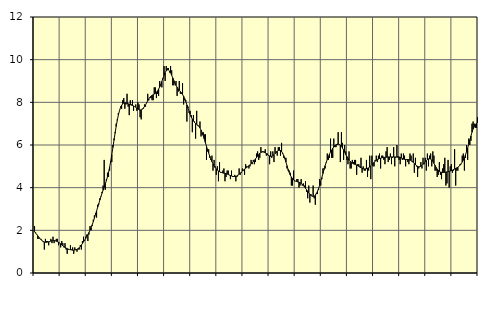
| Category | Piggar | Series 1 |
|---|---|---|
| nan | 2.2 | 1.94 |
| 87.0 | 1.9 | 1.87 |
| 87.0 | 1.8 | 1.81 |
| 87.0 | 1.6 | 1.74 |
| 87.0 | 1.6 | 1.67 |
| 87.0 | 1.6 | 1.61 |
| 87.0 | 1.6 | 1.56 |
| 87.0 | 1.5 | 1.51 |
| 87.0 | 1.5 | 1.47 |
| 87.0 | 1.1 | 1.45 |
| 87.0 | 1.6 | 1.44 |
| 87.0 | 1.5 | 1.44 |
| nan | 1.5 | 1.45 |
| 88.0 | 1.3 | 1.46 |
| 88.0 | 1.5 | 1.48 |
| 88.0 | 1.6 | 1.5 |
| 88.0 | 1.4 | 1.51 |
| 88.0 | 1.7 | 1.52 |
| 88.0 | 1.4 | 1.52 |
| 88.0 | 1.5 | 1.51 |
| 88.0 | 1.6 | 1.49 |
| 88.0 | 1.6 | 1.47 |
| 88.0 | 1.3 | 1.44 |
| 88.0 | 1.4 | 1.41 |
| nan | 1.2 | 1.37 |
| 89.0 | 1.5 | 1.32 |
| 89.0 | 1.4 | 1.28 |
| 89.0 | 1.2 | 1.24 |
| 89.0 | 1.4 | 1.2 |
| 89.0 | 1.1 | 1.17 |
| 89.0 | 0.9 | 1.14 |
| 89.0 | 1.1 | 1.12 |
| 89.0 | 1.1 | 1.1 |
| 89.0 | 1.3 | 1.09 |
| 89.0 | 1.1 | 1.08 |
| 89.0 | 1.2 | 1.07 |
| nan | 0.9 | 1.07 |
| 90.0 | 1.2 | 1.08 |
| 90.0 | 1.1 | 1.09 |
| 90.0 | 1 | 1.11 |
| 90.0 | 1.1 | 1.14 |
| 90.0 | 1.1 | 1.18 |
| 90.0 | 1.3 | 1.24 |
| 90.0 | 1.1 | 1.31 |
| 90.0 | 1.5 | 1.38 |
| 90.0 | 1.7 | 1.46 |
| 90.0 | 1.5 | 1.54 |
| 90.0 | 1.7 | 1.62 |
| nan | 1.8 | 1.71 |
| 91.0 | 1.5 | 1.8 |
| 91.0 | 1.8 | 1.9 |
| 91.0 | 2.2 | 2.01 |
| 91.0 | 2 | 2.13 |
| 91.0 | 2.2 | 2.26 |
| 91.0 | 2.5 | 2.41 |
| 91.0 | 2.7 | 2.57 |
| 91.0 | 2.8 | 2.74 |
| 91.0 | 2.6 | 2.91 |
| 91.0 | 3.2 | 3.08 |
| 91.0 | 3.2 | 3.25 |
| nan | 3.5 | 3.42 |
| 92.0 | 3.6 | 3.58 |
| 92.0 | 3.8 | 3.74 |
| 92.0 | 4.1 | 3.88 |
| 92.0 | 5.3 | 4.02 |
| 92.0 | 3.9 | 4.17 |
| 92.0 | 4.4 | 4.33 |
| 92.0 | 4.7 | 4.51 |
| 92.0 | 4.5 | 4.72 |
| 92.0 | 4.8 | 4.96 |
| 92.0 | 5.2 | 5.24 |
| 92.0 | 5.2 | 5.55 |
| nan | 6 | 5.88 |
| 93.0 | 6.3 | 6.22 |
| 93.0 | 6.6 | 6.55 |
| 93.0 | 7 | 6.87 |
| 93.0 | 7.2 | 7.15 |
| 93.0 | 7.5 | 7.4 |
| 93.0 | 7.6 | 7.6 |
| 93.0 | 7.8 | 7.76 |
| 93.0 | 7.7 | 7.86 |
| 93.0 | 8.1 | 7.93 |
| 93.0 | 8.2 | 7.97 |
| 93.0 | 7.7 | 7.98 |
| nan | 7.9 | 7.97 |
| 94.0 | 8.4 | 7.96 |
| 94.0 | 7.8 | 7.93 |
| 94.0 | 7.4 | 7.91 |
| 94.0 | 8.1 | 7.89 |
| 94.0 | 7.9 | 7.87 |
| 94.0 | 8.1 | 7.85 |
| 94.0 | 7.6 | 7.83 |
| 94.0 | 7.8 | 7.8 |
| 94.0 | 7.9 | 7.77 |
| 94.0 | 7.6 | 7.73 |
| 94.0 | 8 | 7.69 |
| nan | 7.9 | 7.66 |
| 95.0 | 7.3 | 7.64 |
| 95.0 | 7.2 | 7.65 |
| 95.0 | 7.7 | 7.68 |
| 95.0 | 7.7 | 7.73 |
| 95.0 | 7.9 | 7.8 |
| 95.0 | 7.8 | 7.88 |
| 95.0 | 8 | 7.98 |
| 95.0 | 8.4 | 8.07 |
| 95.0 | 8.1 | 8.16 |
| 95.0 | 8.2 | 8.23 |
| 95.0 | 8.2 | 8.29 |
| nan | 8.1 | 8.32 |
| 96.0 | 8.1 | 8.36 |
| 96.0 | 8.7 | 8.39 |
| 96.0 | 8.7 | 8.42 |
| 96.0 | 8.2 | 8.47 |
| 96.0 | 8.4 | 8.53 |
| 96.0 | 8.3 | 8.62 |
| 96.0 | 9 | 8.72 |
| 96.0 | 8.8 | 8.84 |
| 96.0 | 8.7 | 8.98 |
| 96.0 | 9.1 | 9.13 |
| 96.0 | 9.7 | 9.27 |
| nan | 9 | 9.39 |
| 97.0 | 9.7 | 9.48 |
| 97.0 | 9.6 | 9.52 |
| 97.0 | 9.6 | 9.52 |
| 97.0 | 9.4 | 9.47 |
| 97.0 | 9.7 | 9.39 |
| 97.0 | 9.5 | 9.27 |
| 97.0 | 8.8 | 9.15 |
| 97.0 | 8.8 | 9.02 |
| 97.0 | 8.9 | 8.9 |
| 97.0 | 9 | 8.79 |
| 97.0 | 8.3 | 8.71 |
| nan | 8.5 | 8.63 |
| 98.0 | 9 | 8.57 |
| 98.0 | 8.4 | 8.51 |
| 98.0 | 8.4 | 8.45 |
| 98.0 | 8.9 | 8.37 |
| 98.0 | 7.9 | 8.28 |
| 98.0 | 8.1 | 8.17 |
| 98.0 | 8.1 | 8.03 |
| 98.0 | 7.1 | 7.88 |
| 98.0 | 7.8 | 7.73 |
| 98.0 | 7.5 | 7.58 |
| 98.0 | 7.6 | 7.44 |
| nan | 7.4 | 7.31 |
| 99.0 | 6.6 | 7.21 |
| 99.0 | 7.4 | 7.13 |
| 99.0 | 7.1 | 7.06 |
| 99.0 | 6.3 | 7.01 |
| 99.0 | 7.6 | 6.97 |
| 99.0 | 6.9 | 6.93 |
| 99.0 | 6.9 | 6.88 |
| 99.0 | 7.1 | 6.8 |
| 99.0 | 6.4 | 6.7 |
| 99.0 | 6.5 | 6.58 |
| 99.0 | 6.6 | 6.44 |
| nan | 6.5 | 6.28 |
| 0.0 | 6.5 | 6.11 |
| 0.0 | 5.3 | 5.94 |
| 0.0 | 5.7 | 5.78 |
| 0.0 | 5.8 | 5.62 |
| 0.0 | 5.4 | 5.48 |
| 0.0 | 5.3 | 5.34 |
| 0.0 | 5.5 | 5.22 |
| 0.0 | 4.8 | 5.11 |
| 0.0 | 5.3 | 5.02 |
| 0.0 | 5 | 4.94 |
| 0.0 | 4.6 | 4.88 |
| nan | 5 | 4.82 |
| 1.0 | 4.3 | 4.78 |
| 1.0 | 5.2 | 4.75 |
| 1.0 | 4.7 | 4.72 |
| 1.0 | 4.7 | 4.71 |
| 1.0 | 4.8 | 4.69 |
| 1.0 | 4.9 | 4.68 |
| 1.0 | 4.3 | 4.67 |
| 1.0 | 4.5 | 4.66 |
| 1.0 | 4.8 | 4.64 |
| 1.0 | 4.8 | 4.62 |
| 1.0 | 4.6 | 4.59 |
| nan | 4.4 | 4.57 |
| 2.0 | 4.8 | 4.55 |
| 2.0 | 4.5 | 4.53 |
| 2.0 | 4.5 | 4.52 |
| 2.0 | 4.6 | 4.52 |
| 2.0 | 4.3 | 4.53 |
| 2.0 | 4.5 | 4.55 |
| 2.0 | 4.6 | 4.59 |
| 2.0 | 4.9 | 4.63 |
| 2.0 | 4.6 | 4.68 |
| 2.0 | 4.7 | 4.73 |
| 2.0 | 4.9 | 4.78 |
| nan | 4.8 | 4.83 |
| 3.0 | 4.6 | 4.87 |
| 3.0 | 5.1 | 4.91 |
| 3.0 | 5 | 4.95 |
| 3.0 | 5 | 4.99 |
| 3.0 | 4.9 | 5.03 |
| 3.0 | 5 | 5.07 |
| 3.0 | 5.3 | 5.12 |
| 3.0 | 5.1 | 5.17 |
| 3.0 | 5.3 | 5.22 |
| 3.0 | 5.1 | 5.28 |
| 3.0 | 5.2 | 5.35 |
| nan | 5.6 | 5.41 |
| 4.0 | 5.7 | 5.48 |
| 4.0 | 5.3 | 5.55 |
| 4.0 | 5.4 | 5.61 |
| 4.0 | 5.9 | 5.65 |
| 4.0 | 5.7 | 5.67 |
| 4.0 | 5.7 | 5.68 |
| 4.0 | 5.7 | 5.66 |
| 4.0 | 5.8 | 5.63 |
| 4.0 | 5.5 | 5.6 |
| 4.0 | 5.6 | 5.55 |
| 4.0 | 5.5 | 5.52 |
| nan | 5.1 | 5.49 |
| 5.0 | 5.7 | 5.47 |
| 5.0 | 5.4 | 5.47 |
| 5.0 | 5.7 | 5.5 |
| 5.0 | 5.2 | 5.54 |
| 5.0 | 5.9 | 5.59 |
| 5.0 | 5.7 | 5.65 |
| 5.0 | 5.5 | 5.7 |
| 5.0 | 5.9 | 5.74 |
| 5.0 | 5.9 | 5.75 |
| 5.0 | 5.5 | 5.74 |
| 5.0 | 6.1 | 5.7 |
| nan | 5.6 | 5.62 |
| 6.0 | 5.4 | 5.5 |
| 6.0 | 5.4 | 5.36 |
| 6.0 | 5.4 | 5.2 |
| 6.0 | 4.9 | 5.03 |
| 6.0 | 4.8 | 4.86 |
| 6.0 | 4.8 | 4.72 |
| 6.0 | 4.7 | 4.59 |
| 6.0 | 4.1 | 4.5 |
| 6.0 | 4.1 | 4.42 |
| 6.0 | 4.8 | 4.37 |
| 6.0 | 4.3 | 4.33 |
| nan | 4.3 | 4.3 |
| 7.0 | 4.4 | 4.29 |
| 7.0 | 4.4 | 4.27 |
| 7.0 | 4 | 4.26 |
| 7.0 | 4.1 | 4.23 |
| 7.0 | 4.4 | 4.2 |
| 7.0 | 4.1 | 4.15 |
| 7.0 | 4.2 | 4.1 |
| 7.0 | 4.1 | 4.04 |
| 7.0 | 4.3 | 3.97 |
| 7.0 | 3.8 | 3.9 |
| 7.0 | 3.5 | 3.83 |
| nan | 4.1 | 3.76 |
| 8.0 | 3.3 | 3.69 |
| 8.0 | 3.7 | 3.63 |
| 8.0 | 3.6 | 3.6 |
| 8.0 | 4.1 | 3.59 |
| 8.0 | 3.5 | 3.6 |
| 8.0 | 3.2 | 3.65 |
| 8.0 | 3.7 | 3.73 |
| 8.0 | 3.7 | 3.83 |
| 8.0 | 3.9 | 3.96 |
| 8.0 | 4.4 | 4.12 |
| 8.0 | 4.1 | 4.29 |
| nan | 4.4 | 4.47 |
| 9.0 | 4.9 | 4.66 |
| 9.0 | 4.9 | 4.85 |
| 9.0 | 4.9 | 5.03 |
| 9.0 | 5.2 | 5.18 |
| 9.0 | 5.6 | 5.32 |
| 9.0 | 5.3 | 5.45 |
| 9.0 | 5.4 | 5.57 |
| 9.0 | 6.3 | 5.67 |
| 9.0 | 5.4 | 5.76 |
| 9.0 | 5.4 | 5.84 |
| 9.0 | 6.3 | 5.91 |
| nan | 5.9 | 5.97 |
| 10.0 | 5.9 | 6.01 |
| 10.0 | 6 | 6.04 |
| 10.0 | 6.6 | 6.04 |
| 10.0 | 6 | 6.03 |
| 10.0 | 5.2 | 6 |
| 10.0 | 6.6 | 5.94 |
| 10.0 | 6.1 | 5.86 |
| 10.0 | 5.3 | 5.76 |
| 10.0 | 6 | 5.66 |
| 10.0 | 5.7 | 5.55 |
| 10.0 | 5.3 | 5.46 |
| nan | 5.1 | 5.37 |
| 11.0 | 5.7 | 5.29 |
| 11.0 | 4.9 | 5.23 |
| 11.0 | 4.9 | 5.18 |
| 11.0 | 5.3 | 5.15 |
| 11.0 | 5.2 | 5.12 |
| 11.0 | 5.3 | 5.1 |
| 11.0 | 5.3 | 5.08 |
| 11.0 | 4.6 | 5.06 |
| 11.0 | 5.1 | 5.03 |
| 11.0 | 5.1 | 5 |
| 11.0 | 5 | 4.96 |
| nan | 5.4 | 4.93 |
| 12.0 | 4.7 | 4.91 |
| 12.0 | 5 | 4.89 |
| 12.0 | 4.8 | 4.88 |
| 12.0 | 4.8 | 4.88 |
| 12.0 | 5.3 | 4.89 |
| 12.0 | 4.5 | 4.91 |
| 12.0 | 4.8 | 4.93 |
| 12.0 | 5.5 | 4.97 |
| 12.0 | 4.4 | 5.02 |
| 12.0 | 5.5 | 5.08 |
| 12.0 | 5 | 5.14 |
| nan | 5 | 5.19 |
| 13.0 | 5.3 | 5.24 |
| 13.0 | 5.5 | 5.28 |
| 13.0 | 5.2 | 5.32 |
| 13.0 | 5.5 | 5.34 |
| 13.0 | 5.6 | 5.37 |
| 13.0 | 4.9 | 5.38 |
| 13.0 | 5.5 | 5.4 |
| 13.0 | 5.5 | 5.41 |
| 13.0 | 5.3 | 5.42 |
| 13.0 | 5.1 | 5.42 |
| 13.0 | 5.7 | 5.43 |
| nan | 5.9 | 5.43 |
| 14.0 | 5.2 | 5.44 |
| 14.0 | 5.3 | 5.44 |
| 14.0 | 5.6 | 5.44 |
| 14.0 | 5.1 | 5.44 |
| 14.0 | 5.4 | 5.44 |
| 14.0 | 5.9 | 5.44 |
| 14.0 | 5 | 5.44 |
| 14.0 | 5.4 | 5.44 |
| 14.0 | 6 | 5.45 |
| 14.0 | 5.4 | 5.45 |
| 14.0 | 5.3 | 5.44 |
| nan | 5.1 | 5.42 |
| 15.0 | 5.6 | 5.39 |
| 15.0 | 5.3 | 5.37 |
| 15.0 | 5.6 | 5.34 |
| 15.0 | 5.5 | 5.33 |
| 15.0 | 5 | 5.32 |
| 15.0 | 5.3 | 5.32 |
| 15.0 | 5.2 | 5.32 |
| 15.0 | 5.1 | 5.31 |
| 15.0 | 5.6 | 5.3 |
| 15.0 | 5.5 | 5.27 |
| 15.0 | 5.2 | 5.23 |
| nan | 5.6 | 5.19 |
| 16.0 | 4.7 | 5.13 |
| 16.0 | 5.4 | 5.08 |
| 16.0 | 5 | 5.03 |
| 16.0 | 4.5 | 5 |
| 16.0 | 4.9 | 4.98 |
| 16.0 | 5 | 4.98 |
| 16.0 | 5.2 | 5.01 |
| 16.0 | 4.9 | 5.04 |
| 16.0 | 5.4 | 5.09 |
| 16.0 | 5.1 | 5.15 |
| 16.0 | 5.4 | 5.21 |
| nan | 4.8 | 5.27 |
| 17.0 | 5.6 | 5.32 |
| 17.0 | 5 | 5.35 |
| 17.0 | 5.5 | 5.35 |
| 17.0 | 5.6 | 5.34 |
| 17.0 | 5 | 5.3 |
| 17.0 | 5.7 | 5.23 |
| 17.0 | 5.5 | 5.14 |
| 17.0 | 4.8 | 5.05 |
| 17.0 | 4.8 | 4.95 |
| 17.0 | 4.5 | 4.87 |
| 17.0 | 4.6 | 4.81 |
| nan | 5.2 | 4.76 |
| 18.0 | 4.6 | 4.73 |
| 18.0 | 4.4 | 4.72 |
| 18.0 | 4.9 | 4.71 |
| 18.0 | 5.1 | 4.71 |
| 18.0 | 5.4 | 4.72 |
| 18.0 | 4.1 | 4.73 |
| 18.0 | 4.2 | 4.74 |
| 18.0 | 5.3 | 4.75 |
| 18.0 | 4 | 4.76 |
| 18.0 | 5 | 4.78 |
| 18.0 | 5.1 | 4.8 |
| nan | 4.7 | 4.82 |
| 19.0 | 4.8 | 4.85 |
| 19.0 | 5.8 | 4.87 |
| 19.0 | 4.1 | 4.9 |
| 19.0 | 4.8 | 4.93 |
| 19.0 | 4.8 | 4.96 |
| 19.0 | 5 | 5 |
| 19.0 | 5.1 | 5.05 |
| 19.0 | 5.1 | 5.12 |
| 19.0 | 5.5 | 5.2 |
| 19.0 | 5.6 | 5.29 |
| 19.0 | 4.8 | 5.4 |
| nan | 5.4 | 5.54 |
| 20.0 | 6 | 5.69 |
| 20.0 | 5.3 | 5.86 |
| 20.0 | 6.3 | 6.04 |
| 20.0 | 6 | 6.23 |
| 20.0 | 6.2 | 6.42 |
| 20.0 | 7 | 6.6 |
| 20.0 | 7.1 | 6.75 |
| 20.0 | 7 | 6.87 |
| 20.0 | 6.8 | 6.96 |
| 20.0 | 6.8 | 7.01 |
| 20.0 | 7.3 | 7.04 |